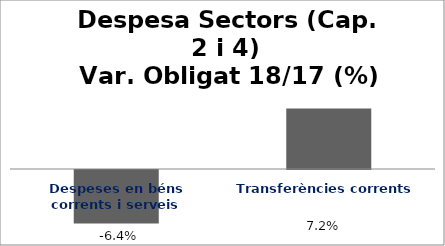
| Category | Series 0 |
|---|---|
| Despeses en béns corrents i serveis | -0.064 |
| Transferències corrents | 0.072 |